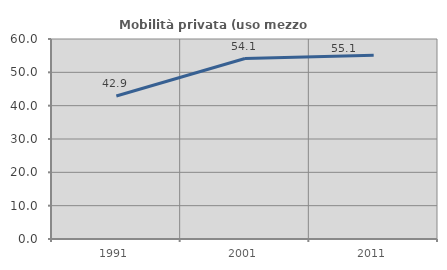
| Category | Mobilità privata (uso mezzo privato) |
|---|---|
| 1991.0 | 42.916 |
| 2001.0 | 54.131 |
| 2011.0 | 55.138 |